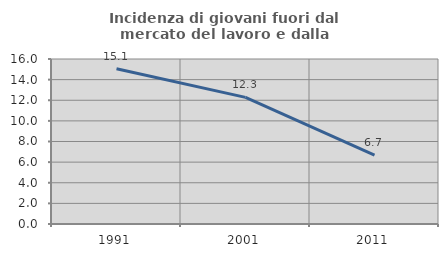
| Category | Incidenza di giovani fuori dal mercato del lavoro e dalla formazione  |
|---|---|
| 1991.0 | 15.054 |
| 2001.0 | 12.275 |
| 2011.0 | 6.688 |